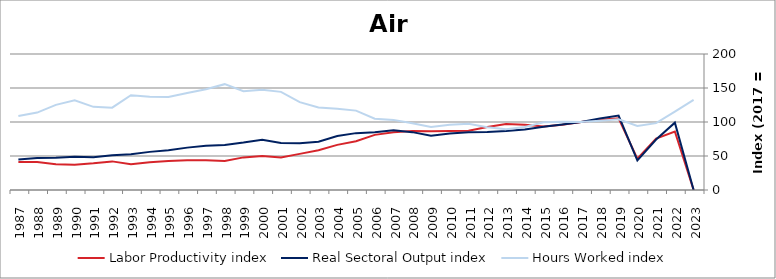
| Category | Labor Productivity index | Real Sectoral Output index | Hours Worked index |
|---|---|---|---|
| 2023.0 | 0 | 0 | 132.668 |
| 2022.0 | 86.01 | 99.04 | 115.149 |
| 2021.0 | 75.537 | 74.298 | 98.359 |
| 2020.0 | 46.048 | 43.375 | 94.195 |
| 2019.0 | 105.268 | 109.382 | 103.907 |
| 2018.0 | 103.197 | 105.129 | 101.873 |
| 2017.0 | 100 | 100 | 100 |
| 2016.0 | 96.07 | 96.293 | 100.233 |
| 2015.0 | 93.555 | 93.139 | 99.555 |
| 2014.0 | 95.948 | 89.029 | 92.788 |
| 2013.0 | 96.922 | 86.65 | 89.402 |
| 2012.0 | 92.631 | 85.426 | 92.222 |
| 2011.0 | 87.1 | 84.851 | 97.418 |
| 2010.0 | 86.652 | 83.248 | 96.071 |
| 2009.0 | 86.216 | 79.847 | 92.612 |
| 2008.0 | 86.668 | 85.097 | 98.188 |
| 2007.0 | 85.055 | 87.698 | 103.108 |
| 2006.0 | 81.062 | 84.908 | 104.745 |
| 2005.0 | 71.649 | 83.636 | 116.731 |
| 2004.0 | 66.377 | 79.419 | 119.649 |
| 2003.0 | 58.499 | 71.015 | 121.394 |
| 2002.0 | 53.112 | 68.606 | 129.173 |
| 2001.0 | 47.914 | 69.138 | 144.295 |
| 2000.0 | 50.11 | 73.906 | 147.489 |
| 1999.0 | 47.963 | 69.704 | 145.33 |
| 1998.0 | 42.604 | 66.303 | 155.627 |
| 1997.0 | 43.898 | 65.025 | 148.127 |
| 1996.0 | 43.715 | 62.316 | 142.552 |
| 1995.0 | 42.667 | 58.356 | 136.77 |
| 1994.0 | 40.846 | 56.068 | 137.265 |
| 1993.0 | 37.708 | 52.543 | 139.343 |
| 1992.0 | 42.083 | 50.952 | 121.076 |
| 1991.0 | 39.269 | 48.008 | 122.255 |
| 1990.0 | 37.18 | 49.022 | 131.851 |
| 1989.0 | 37.886 | 47.437 | 125.213 |
| 1988.0 | 41.179 | 46.898 | 113.886 |
| 1987.0 | 41.276 | 44.855 | 108.672 |